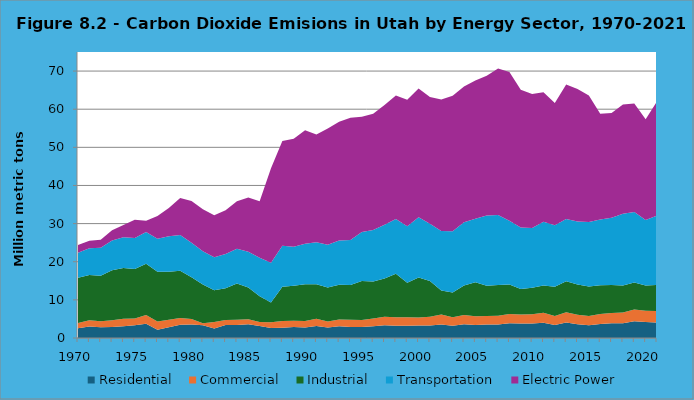
| Category | Residential | Commercial | Industrial | Transportation | Electric Power |
|---|---|---|---|---|---|
| 1970.0 | 2.549 | 1.395 | 11.886 | 6.523 | 2.039 |
| 1971.0 | 2.984 | 1.665 | 11.867 | 7.013 | 1.982 |
| 1972.0 | 2.84 | 1.536 | 11.954 | 7.346 | 2.104 |
| 1973.0 | 2.866 | 1.771 | 13.124 | 7.816 | 2.667 |
| 1974.0 | 3.059 | 1.963 | 13.365 | 8.023 | 3.204 |
| 1975.0 | 3.351 | 1.747 | 12.984 | 8.134 | 4.786 |
| 1976.0 | 3.715 | 2.299 | 13.478 | 8.297 | 2.975 |
| 1977.0 | 2.192 | 2.127 | 13.028 | 8.658 | 5.966 |
| 1978.0 | 2.794 | 1.994 | 12.602 | 9.276 | 7.44 |
| 1979.0 | 3.478 | 1.76 | 12.38 | 9.404 | 9.662 |
| 1980.0 | 3.556 | 1.459 | 10.909 | 9.046 | 10.978 |
| 1981.0 | 3.316 | 0.567 | 10.123 | 8.76 | 10.991 |
| 1982.0 | 2.501 | 1.703 | 8.297 | 8.68 | 11.038 |
| 1983.0 | 3.38 | 1.367 | 8.324 | 8.976 | 11.457 |
| 1984.0 | 3.399 | 1.408 | 9.454 | 9.118 | 12.457 |
| 1985.0 | 3.613 | 1.272 | 8.338 | 9.404 | 14.25 |
| 1986.0 | 3.133 | 1.051 | 6.762 | 10.109 | 14.835 |
| 1987.0 | 2.596 | 1.515 | 5.214 | 10.416 | 24.795 |
| 1988.0 | 2.679 | 1.768 | 8.973 | 10.761 | 27.474 |
| 1989.0 | 2.866 | 1.634 | 9.219 | 10.184 | 28.364 |
| 1990.0 | 2.759 | 1.689 | 9.66 | 10.606 | 29.76 |
| 1991.0 | 3.128 | 1.909 | 9.048 | 11.015 | 28.285 |
| 1992.0 | 2.744 | 1.599 | 8.925 | 11.209 | 30.492 |
| 1993.0 | 3.109 | 1.712 | 9.112 | 11.613 | 31.139 |
| 1994.0 | 2.878 | 1.912 | 9.097 | 11.833 | 32.049 |
| 1995.0 | 2.855 | 1.866 | 10.229 | 12.879 | 30.171 |
| 1996.0 | 3.108 | 2.023 | 9.703 | 13.517 | 30.452 |
| 1997.0 | 3.367 | 2.206 | 10.023 | 14.105 | 31.433 |
| 1998.0 | 3.236 | 2.196 | 11.42 | 14.344 | 32.373 |
| 1999.0 | 3.225 | 2.227 | 9.053 | 14.827 | 33.114 |
| 2000.0 | 3.254 | 2.105 | 10.524 | 15.774 | 33.745 |
| 2001.0 | 3.296 | 2.281 | 9.35 | 15.063 | 33.2 |
| 2002.0 | 3.537 | 2.599 | 6.289 | 15.638 | 34.499 |
| 2003.0 | 3.23 | 2.185 | 6.546 | 16.022 | 35.567 |
| 2004.0 | 3.58 | 2.461 | 7.751 | 16.573 | 35.592 |
| 2005.0 | 3.396 | 2.316 | 8.906 | 16.678 | 36.234 |
| 2006.0 | 3.54 | 2.254 | 7.89 | 18.462 | 36.616 |
| 2007.0 | 3.548 | 2.271 | 8.087 | 18.324 | 38.469 |
| 2008.0 | 3.885 | 2.42 | 7.714 | 16.751 | 39.018 |
| 2009.0 | 3.785 | 2.368 | 6.694 | 16.152 | 36.085 |
| 2010.0 | 3.789 | 2.425 | 6.971 | 15.68 | 35.141 |
| 2011.0 | 4.006 | 2.6 | 7.148 | 16.716 | 33.988 |
| 2012.0 | 3.428 | 2.321 | 7.683 | 16.107 | 32.097 |
| 2013.0 | 4.063 | 2.693 | 8.115 | 16.353 | 35.255 |
| 2014.0 | 3.577 | 2.505 | 7.962 | 16.492 | 34.743 |
| 2015.0 | 3.348 | 2.401 | 7.736 | 16.916 | 33.212 |
| 2016.0 | 3.644 | 2.62 | 7.542 | 17.286 | 27.734 |
| 2017.0 | 3.848 | 2.698 | 7.374 | 17.628 | 27.484 |
| 2018.0 | 3.887 | 2.772 | 7.135 | 18.79 | 28.665 |
| 2019.0 | 4.41 | 3.08 | 7.092 | 18.482 | 28.446 |
| 2020.0 | 4.218 | 2.913 | 6.645 | 17.162 | 26.44 |
| 2021.0 | 4.077 | 3.001 | 6.832 | 18.206 | 29.938 |